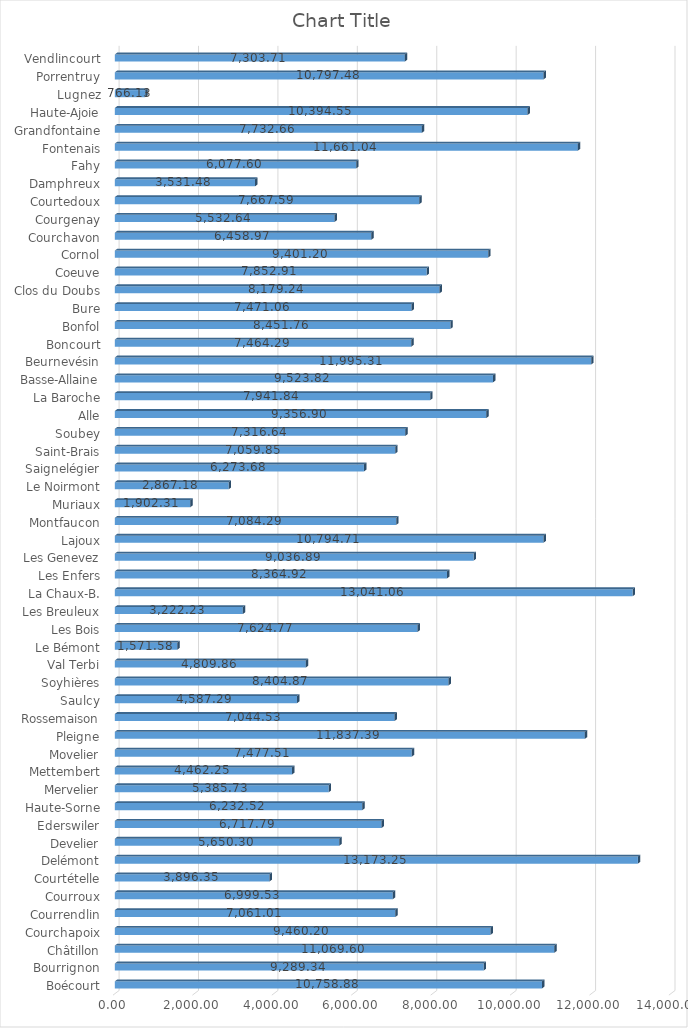
| Category | Series 0 |
|---|---|
| Boécourt | 10758.879 |
| Bourrignon | 9289.339 |
| Châtillon | 11069.598 |
| Courchapoix | 9460.196 |
| Courrendlin | 7061.008 |
| Courroux | 6999.528 |
| Courtételle | 3896.35 |
| Delémont | 13173.246 |
| Develier | 5650.299 |
| Ederswiler | 6717.794 |
| Haute-Sorne | 6232.518 |
| Mervelier | 5385.726 |
| Mettembert | 4462.254 |
| Movelier | 7477.514 |
| Pleigne | 11837.385 |
| Rossemaison | 7044.529 |
| Saulcy | 4587.294 |
| Soyhières | 8404.875 |
| Val Terbi | 4809.86 |
| Le Bémont | 1571.579 |
| Les Bois | 7624.769 |
| Les Breuleux | 3222.233 |
| La Chaux-B. | 13041.063 |
| Les Enfers | 8364.922 |
| Les Genevez | 9036.889 |
| Lajoux | 10794.71 |
| Montfaucon | 7084.286 |
| Muriaux | 1902.307 |
| Le Noirmont | 2867.183 |
| Saignelégier | 6273.676 |
| Saint-Brais | 7059.848 |
| Soubey | 7316.637 |
| Alle | 9356.901 |
| La Baroche | 7941.843 |
| Basse-Allaine | 9523.824 |
| Beurnevésin | 11995.312 |
| Boncourt | 7464.29 |
| Bonfol | 8451.764 |
| Bure | 7471.062 |
| Clos du Doubs | 8179.242 |
| Coeuve | 7852.91 |
| Cornol | 9401.201 |
| Courchavon | 6458.967 |
| Courgenay | 5532.636 |
| Courtedoux | 7667.59 |
| Damphreux | 3531.48 |
| Fahy | 6077.605 |
| Fontenais | 11661.04 |
| Grandfontaine | 7732.663 |
| Haute-Ajoie | 10394.549 |
| Lugnez | 766.129 |
| Porrentruy | 10797.478 |
| Vendlincourt | 7303.709 |